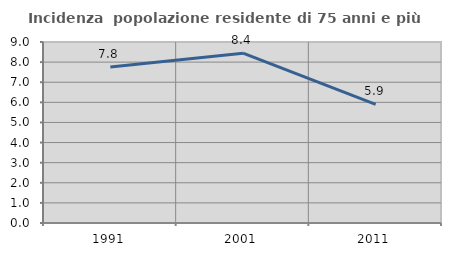
| Category | Incidenza  popolazione residente di 75 anni e più |
|---|---|
| 1991.0 | 7.758 |
| 2001.0 | 8.442 |
| 2011.0 | 5.898 |